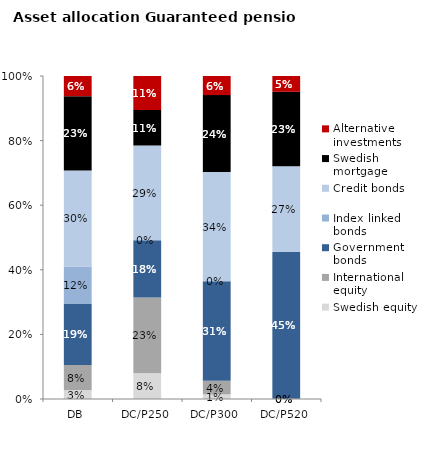
| Category | Swedish equity | International equity | Government bonds | Index linked bonds | Credit bonds | Swedish mortgage | Alternative investments |
|---|---|---|---|---|---|---|---|
| DB | 0.027 | 0.078 | 0.19 | 0.115 | 0.297 | 0.23 | 0.062 |
| DC/P250 | 0.08 | 0.235 | 0.177 | 0 | 0.293 | 0.11 | 0.105 |
| DC/P300 | 0.014 | 0.042 | 0.308 | 0 | 0.338 | 0.238 | 0.059 |
| DC/P520 | 0 | 0 | 0.455 | 0 | 0.266 | 0.23 | 0.049 |